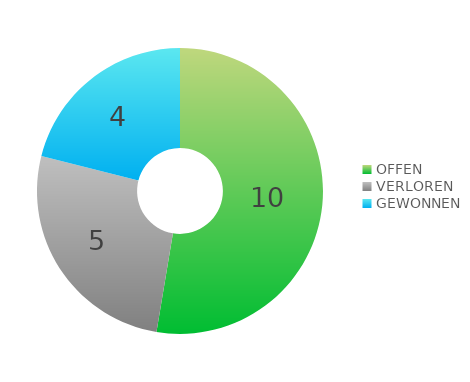
| Category | Series 0 |
|---|---|
| OFFEN | 10 |
| VERLOREN | 5 |
| GEWONNEN | 4 |